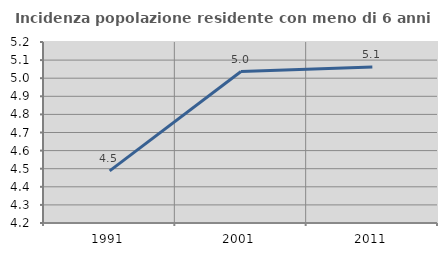
| Category | Incidenza popolazione residente con meno di 6 anni |
|---|---|
| 1991.0 | 4.488 |
| 2001.0 | 5.037 |
| 2011.0 | 5.062 |